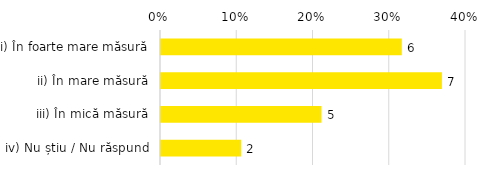
| Category | Total |
|---|---|
| i) În foarte mare măsură | 0.316 |
| ii) În mare măsură | 0.368 |
| iii) În mică măsură | 0.211 |
| iv) Nu știu / Nu răspund | 0.105 |